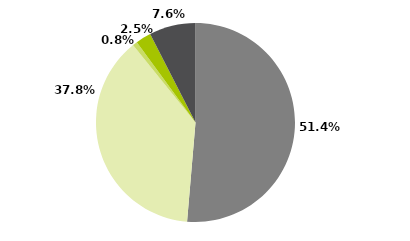
| Category | Series 0 |
|---|---|
| Multimercados Macro | 0.514 |
| Multimercados Livre | 0.378 |
| Multimercados L/S - Neutro | 0.008 |
| Multimercados L/S - Direcional | 0.025 |
| Outros | 0.075 |